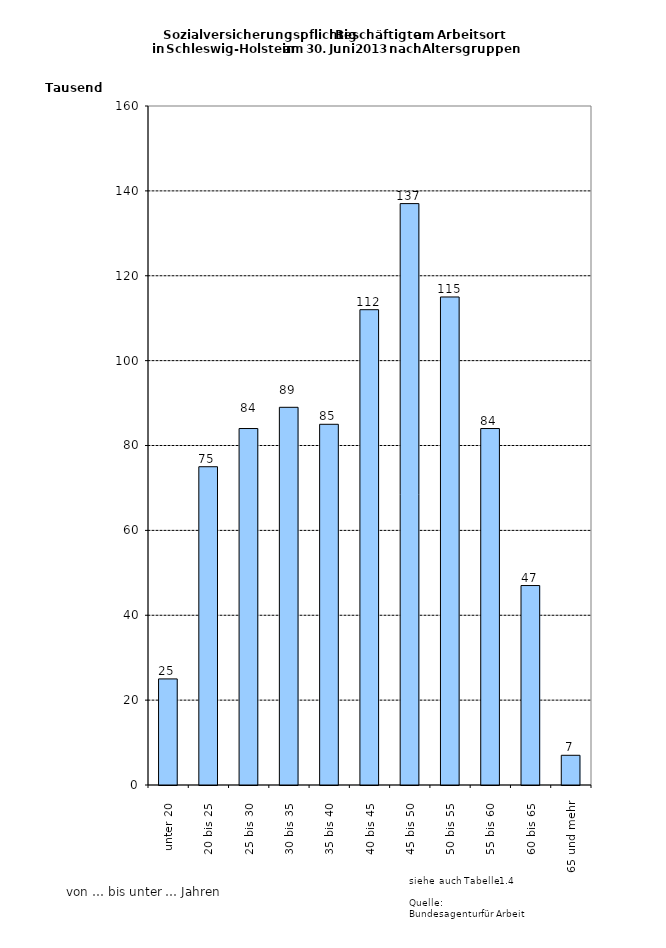
| Category | Series 0 |
|---|---|
| unter 20 | 25000 |
| 20 bis 25 | 75000 |
| 25 bis 30 | 84000 |
| 30 bis 35 | 89000 |
| 35 bis 40 | 85000 |
| 40 bis 45 | 112000 |
| 45 bis 50 | 137000 |
| 50 bis 55 | 115000 |
| 55 bis 60 | 84000 |
| 60 bis 65 | 47000 |
| 65 und mehr | 7000 |